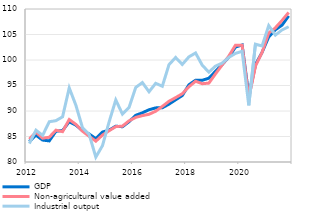
| Category | GDP | Non-agricultural value added | Industrial output |
|---|---|---|---|
| 2012 | 84.024 | 84.494 | 83.609 |
| II | 85.251 | 85.857 | 86.234 |
| III | 84.299 | 84.659 | 85.224 |
| IV | 84.139 | 84.858 | 87.896 |
| 2013 | 86.026 | 86.24 | 88.106 |
| II | 86.173 | 85.95 | 88.862 |
| III | 87.889 | 88.328 | 94.533 |
| IV | 87.227 | 87.378 | 91.137 |
| 2014 | 86.15 | 86.04 | 86.698 |
| II | 85.49 | 85.033 | 85.394 |
| III | 84.574 | 84.08 | 80.962 |
| IV | 85.877 | 85.282 | 83.206 |
| 2015 | 86.251 | 86.137 | 87.873 |
| II | 87.022 | 86.937 | 92.164 |
| III | 86.911 | 87.029 | 89.406 |
| IV | 87.906 | 88.071 | 90.711 |
| 2016 | 89.156 | 88.746 | 94.617 |
| II | 89.647 | 89.092 | 95.578 |
| III | 90.243 | 89.356 | 93.774 |
| IV | 90.611 | 89.952 | 95.428 |
| 2017 | 90.63 | 90.897 | 94.854 |
| II | 91.344 | 91.908 | 99.082 |
| III | 92.197 | 92.623 | 100.494 |
| IV | 93.033 | 93.385 | 99.132 |
| 2018 | 95.145 | 94.758 | 100.62 |
| II | 96.029 | 95.834 | 101.379 |
| III | 96.021 | 95.353 | 98.984 |
| IV | 96.431 | 95.466 | 97.611 |
| 2019 | 97.789 | 97.287 | 98.802 |
| II | 99.113 | 99.042 | 99.392 |
| III | 100.562 | 100.773 | 100.509 |
| IV | 102.537 | 102.897 | 101.296 |
| 2020 | 102.944 | 102.894 | 101.707 |
| II | 93.083 | 92.606 | 91.109 |
| III | 99.099 | 98.825 | 103.1 |
| IV | 101.494 | 101.494 | 102.746 |
| 2021 | 104.528 | 105.299 | 106.758 |
| II | 105.94 | 106.305 | 104.887 |
| III | 106.844 | 107.769 | 105.898 |
| IV | 108.646 | 109.313 | 106.518 |